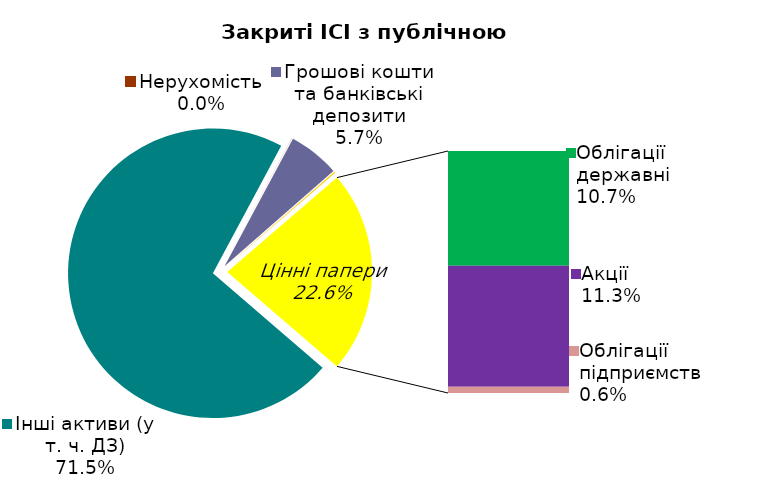
| Category | Series 0 |
|---|---|
| Інші активи (у т. ч. ДЗ) | 0.715 |
| Нерухомість | 0 |
| Грошові кошти та банківські депозити | 0.057 |
| Банківські метали | 0.001 |
| Облігації державні  | 0.107 |
| Акцiї | 0.113 |
| Облігації підприємств | 0.006 |